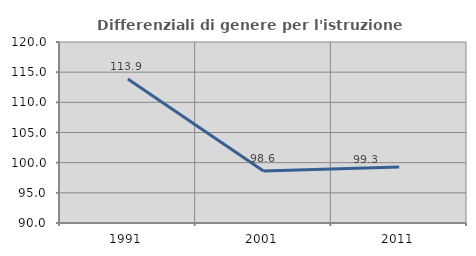
| Category | Differenziali di genere per l'istruzione superiore |
|---|---|
| 1991.0 | 113.856 |
| 2001.0 | 98.617 |
| 2011.0 | 99.298 |